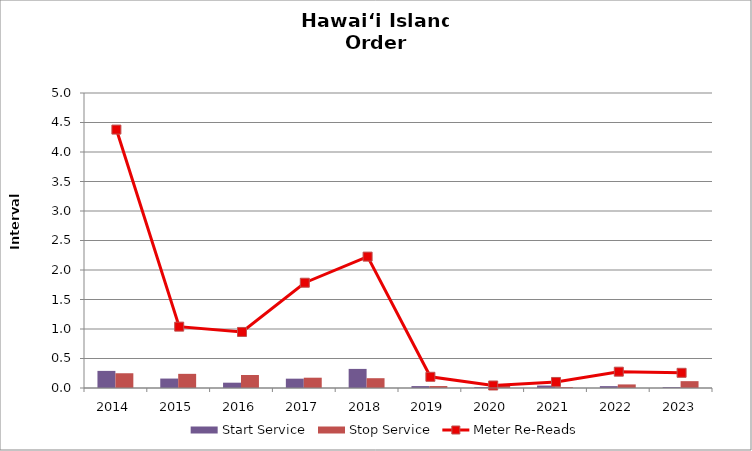
| Category | Start Service | Stop Service |
|---|---|---|
| 2014.0 | 0.29 | 0.25 |
| 2015.0 | 0.16 | 0.24 |
| 2016.0 | 0.09 | 0.22 |
| 2017.0 | 0.158 | 0.175 |
| 2018.0 | 0.324 | 0.166 |
| 2019.0 | 0.033 | 0.033 |
| 2020.0 | 0.015 | 0.043 |
| 2021.0 | 0.041 | 0.015 |
| 2022.0 | 0.032 | 0.061 |
| 2023.0 | 0.014 | 0.116 |